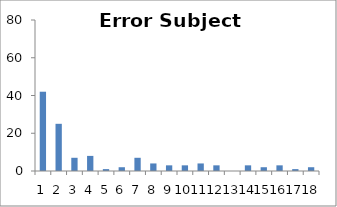
| Category | Sub1 |
|---|---|
| 0 | 42 |
| 1 | 25 |
| 2 | 7 |
| 3 | 8 |
| 4 | 1 |
| 5 | 2 |
| 6 | 7 |
| 7 | 4 |
| 8 | 3 |
| 9 | 3 |
| 10 | 4 |
| 11 | 3 |
| 12 | 0 |
| 13 | 3 |
| 14 | 2 |
| 15 | 3 |
| 16 | 1 |
| 17 | 2 |